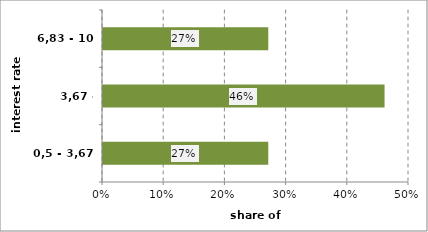
| Category | Series 0 |
|---|---|
| 0,5 - 3,67 | 0.27 |
| 3,67 - 6,83 | 0.46 |
| 6,83 - 10 | 0.27 |